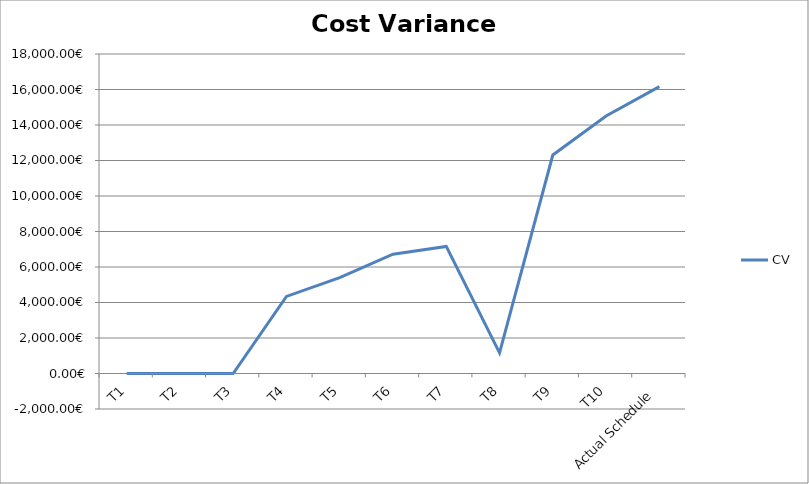
| Category | CV |
|---|---|
| T1 | 0 |
| T2 | 0 |
| T3 | 0 |
| T4 | 4344 |
| T5 | 5400 |
| T6 | 6720 |
| T7 | 7160 |
| T8 | 1160 |
| T9 | 12310 |
| T10 | 14510 |
| Actual Schedule | 16160 |